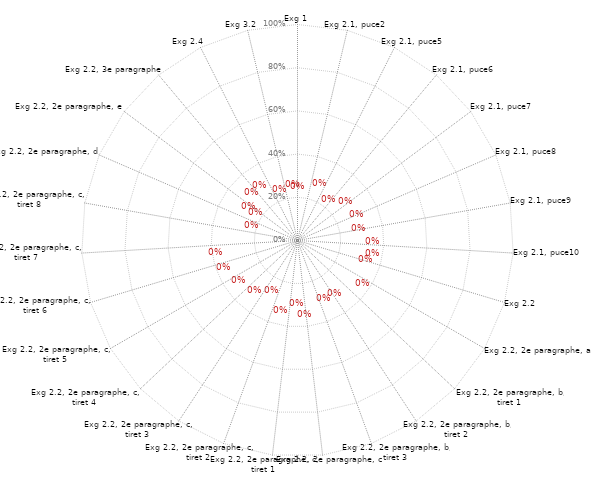
| Category | Annexe IX |
|---|---|
| Exg 1 | 0 |
| Exg 2.1, puce2 | 0 |
| Exg 2.1, puce5 | 0 |
| Exg 2.1, puce6 | 0 |
| Exg 2.1, puce7 | 0 |
| Exg 2.1, puce8 | 0 |
| Exg 2.1, puce9 | 0 |
| Exg 2.1, puce10 | 0 |
| Exg 2.2 | 0 |
| Exg 2.2, 2e paragraphe, a  | 0 |
| Exg 2.2, 2e paragraphe, b, tiret 1 | 0 |
| Exg 2.2, 2e paragraphe, b, tiret 2 | 0 |
| Exg 2.2, 2e paragraphe, b, tiret 3 | 0 |
| Exg 2.2, 2e paragraphe, c | 0 |
| Exg 2.2, 2e paragraphe, c, tiret 1 | 0 |
| Exg 2.2, 2e paragraphe, c, tiret 2 | 0 |
| Exg 2.2, 2e paragraphe, c, tiret 3 | 0 |
| Exg 2.2, 2e paragraphe, c, tiret 4 | 0 |
| Exg 2.2, 2e paragraphe, c, tiret 5 | 0 |
| Exg 2.2, 2e paragraphe, c, tiret 6 | 0 |
| Exg 2.2, 2e paragraphe, c, tiret 7 | 0 |
| Exg 2.2, 2e paragraphe, c, tiret 8 | 0 |
| Exg 2.2, 2e paragraphe, d | 0 |
| Exg 2.2, 2e paragraphe, e | 0 |
| Exg 2.2, 3e paragraphe | 0 |
| Exg 2.4 | 0 |
| Exg 3.2 | 0 |